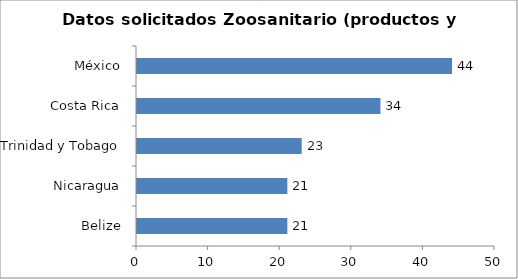
| Category | Series 0 |
|---|---|
| Belize | 21 |
| Nicaragua | 21 |
| Trinidad y Tobago | 23 |
| Costa Rica | 34 |
| México | 44 |